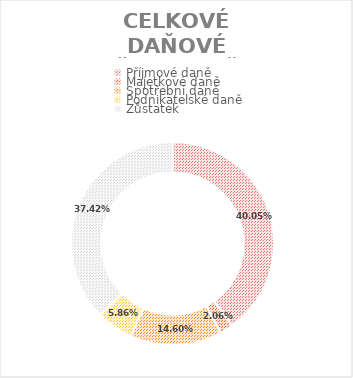
| Category | CELKOVÉ DAŇOVÉ BŘEMENO ČR:  |
|---|---|
| 0 | 0.401 |
| 1 | 0.021 |
| 2 | 0.146 |
| 3 | 0.059 |
| 4 | 0.374 |